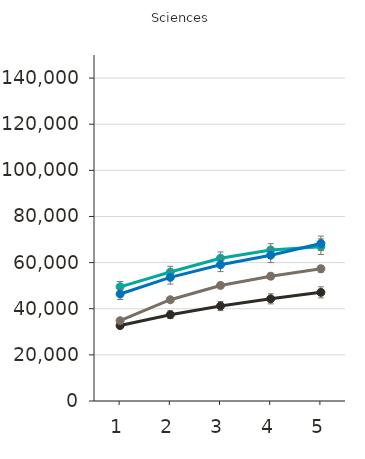
| Category | College-level Certificate | College-level Diploma | Bachelor's Degree | Master's Degree | Doctoral Degree | Professional Degree |
|---|---|---|---|---|---|---|
| 1.0 |  | 32700 | 34800 | 49500 | 46400 |  |
| 2.0 |  | 37400 | 43900 | 55900 | 53600 |  |
| 3.0 |  | 41200 | 50100 | 61900 | 59100 |  |
| 4.0 |  | 44300 | 54100 | 65500 | 63200 |  |
| 5.0 |  | 47100 | 57300 | 66900 | 68300 |  |